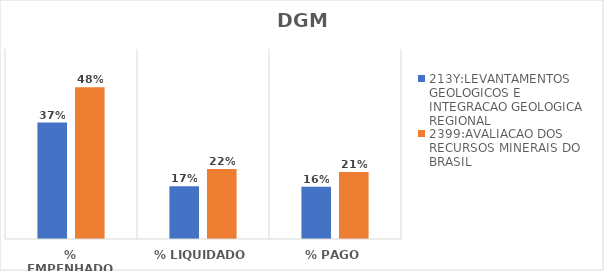
| Category | 213Y:LEVANTAMENTOS GEOLOGICOS E INTEGRACAO GEOLOGICA REGIONAL | 2399:AVALIACAO DOS RECURSOS MINERAIS DO BRASIL |
|---|---|---|
| % EMPENHADO | 0.368 | 0.479 |
| % LIQUIDADO | 0.167 | 0.221 |
| % PAGO | 0.165 | 0.212 |